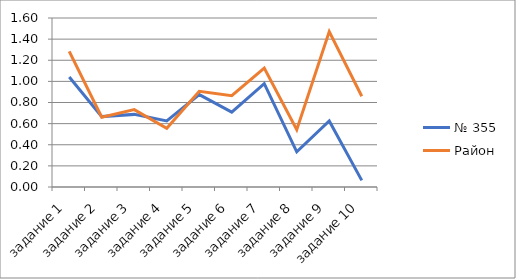
| Category | № 355 | Район |
|---|---|---|
| задание 1 | 1.042 | 1.284 |
| задание 2 | 0.667 | 0.661 |
| задание 3 | 0.688 | 0.733 |
| задание 4 | 0.625 | 0.555 |
| задание 5 | 0.875 | 0.906 |
| задание 6 | 0.708 | 0.865 |
| задание 7 | 0.979 | 1.127 |
| задание 8 | 0.333 | 0.543 |
| задание 9 | 0.625 | 1.472 |
| задание 10 | 0.062 | 0.859 |